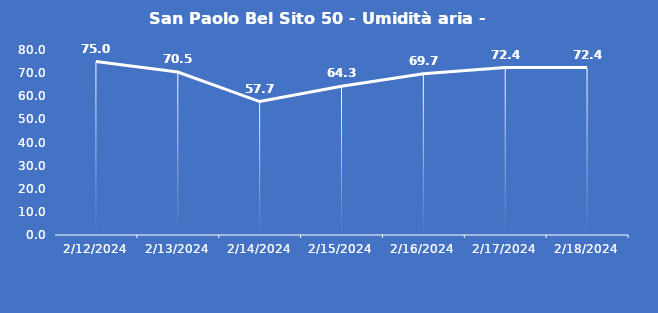
| Category | San Paolo Bel Sito 50 - Umidità aria - Grezzo (%) |
|---|---|
| 2/12/24 | 75 |
| 2/13/24 | 70.5 |
| 2/14/24 | 57.7 |
| 2/15/24 | 64.3 |
| 2/16/24 | 69.7 |
| 2/17/24 | 72.4 |
| 2/18/24 | 72.4 |